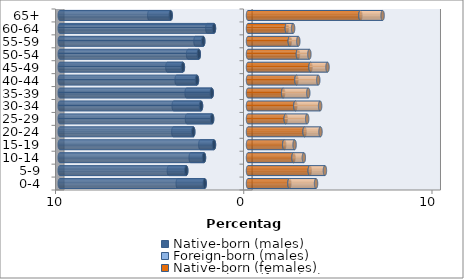
| Category | Native-born (males) | Foreign-born (males) | Native-born (females) | Foreign-born (females) |
|---|---|---|---|---|
| 0-4 | -2.299 | -1.434 | 2.2 | 1.415 |
| 5-9 | -3.281 | -0.923 | 3.281 | 0.806 |
| 10-14 | -2.338 | -0.707 | 2.417 | 0.55 |
| 15-19 | -1.807 | -0.727 | 1.925 | 0.55 |
| 20-24 | -2.908 | -1.061 | 3.006 | 0.845 |
| 25-29 | -1.906 | -1.336 | 2.004 | 1.139 |
| 30-34 | -2.495 | -1.454 | 2.515 | 1.316 |
| 35-39 | -1.925 | -1.336 | 1.866 | 1.336 |
| 40-44 | -2.711 | -1.081 | 2.574 | 1.159 |
| 45-49 | -3.458 | -0.825 | 3.32 | 0.904 |
| 50-54 | -2.613 | -0.57 | 2.652 | 0.609 |
| 55-59 | -2.377 | -0.413 | 2.22 | 0.452 |
| 60-64 | -1.807 | -0.354 | 2.063 | 0.334 |
| 65+ | -4.106 | -1.139 | 5.972 | 1.179 |